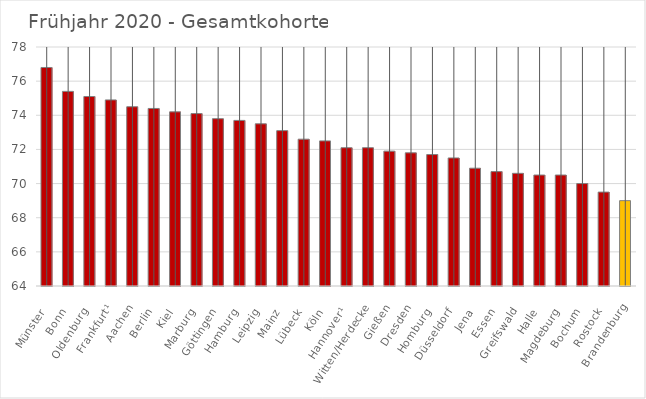
| Category | Mittelwert Ges |
|---|---|
| Münster | 76.8 |
| Bonn | 75.4 |
| Oldenburg | 75.1 |
| Frankfurt¹ | 74.9 |
| Aachen | 74.5 |
| Berlin | 74.4 |
| Kiel | 74.2 |
| Marburg | 74.1 |
| Göttingen | 73.8 |
| Hamburg | 73.7 |
| Leipzig | 73.5 |
| Mainz | 73.1 |
| Lübeck | 72.6 |
| Köln | 72.5 |
| Hannover¹ | 72.1 |
| Witten/Herdecke | 72.1 |
| Gießen | 71.9 |
| Dresden | 71.8 |
| Homburg | 71.7 |
| Düsseldorf | 71.5 |
| Jena | 70.9 |
| Essen | 70.7 |
| Greifswald | 70.6 |
| Halle | 70.5 |
| Magdeburg | 70.5 |
| Bochum | 70 |
| Rostock | 69.5 |
| Brandenburg | 69 |